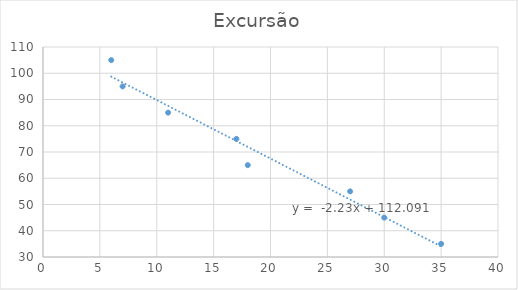
| Category | Excursão |
|---|---|
| 35.0 | 35 |
| 30.0 | 45 |
| 27.0 | 55 |
| 18.0 | 65 |
| 17.0 | 75 |
| 11.0 | 85 |
| 7.0 | 95 |
| 6.0 | 105 |